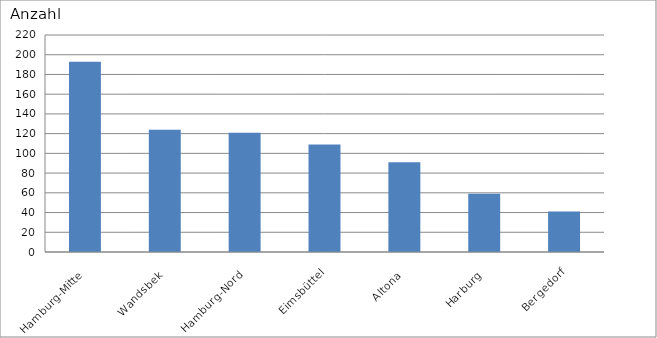
| Category | Hamburg-Mitte |
|---|---|
| Hamburg-Mitte | 193 |
| Wandsbek | 124 |
| Hamburg-Nord | 121 |
| Eimsbüttel | 109 |
| Altona | 91 |
| Harburg | 59 |
| Bergedorf | 41 |